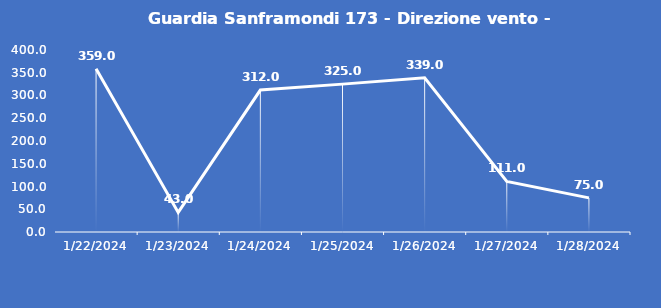
| Category | Guardia Sanframondi 173 - Direzione vento - Grezzo (°N) |
|---|---|
| 1/22/24 | 359 |
| 1/23/24 | 43 |
| 1/24/24 | 312 |
| 1/25/24 | 325 |
| 1/26/24 | 339 |
| 1/27/24 | 111 |
| 1/28/24 | 75 |